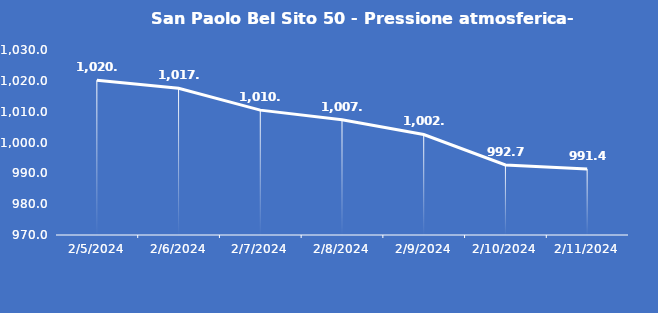
| Category | San Paolo Bel Sito 50 - Pressione atmosferica- Grezzo (hPa) |
|---|---|
| 2/5/24 | 1020.2 |
| 2/6/24 | 1017.6 |
| 2/7/24 | 1010.5 |
| 2/8/24 | 1007.4 |
| 2/9/24 | 1002.6 |
| 2/10/24 | 992.7 |
| 2/11/24 | 991.4 |